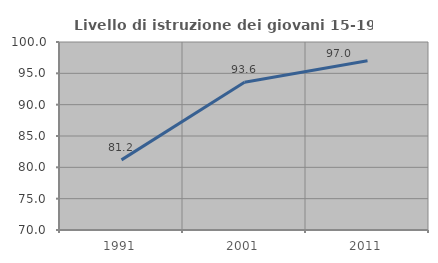
| Category | Livello di istruzione dei giovani 15-19 anni |
|---|---|
| 1991.0 | 81.19 |
| 2001.0 | 93.587 |
| 2011.0 | 97.005 |